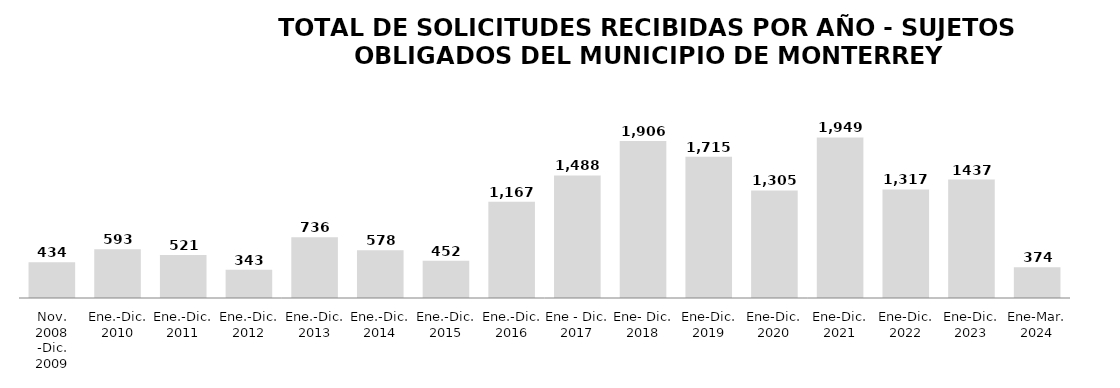
| Category | TOTAL DE SOLICITUDES RECIBIDAS POR AÑO - SUJETOS OBLIGADOS DEL MUNICIPIO DE MONTERREY |
|---|---|
| Nov. 2008 -Dic. 2009 | 434 |
| Ene.-Dic. 2010 | 593 |
| Ene.-Dic. 2011 | 521 |
| Ene.-Dic. 2012 | 343 |
| Ene.-Dic. 2013 | 736 |
| Ene.-Dic. 2014 | 578 |
| Ene.-Dic. 2015 | 452 |
| Ene.-Dic. 2016 | 1167 |
| Ene - Dic. 2017 | 1488 |
| Ene- Dic. 2018 | 1906 |
| Ene-Dic. 2019 | 1715 |
| Ene-Dic. 2020 | 1305 |
| Ene-Dic. 2021 | 1949 |
| Ene-Dic. 2022 | 1317 |
| Ene-Dic. 2023 | 1437 |
| Ene-Mar. 2024 | 374 |